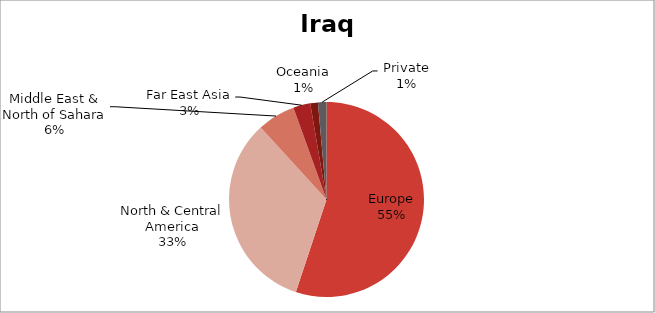
| Category | US$ millions |
|---|---|
| Europe | 1003.224 |
| North & Central America | 603.003 |
| Middle East & North of Sahara | 114.484 |
| Far East Asia | 51.652 |
| Oceania | 23.214 |
| Private | 25.493 |